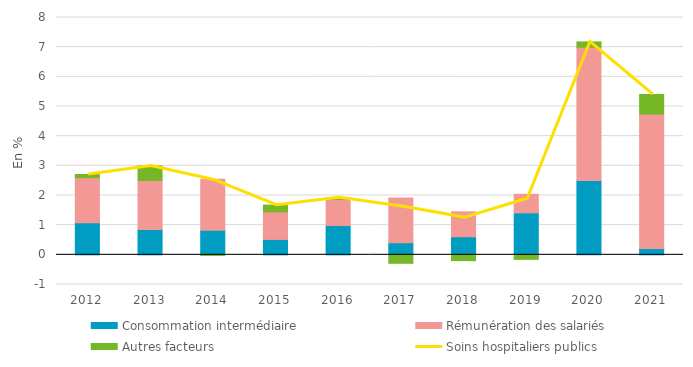
| Category | Consommation intermédiaire | Rémunération des salariés | Autres facteurs |
|---|---|---|---|
| 2012.0 | 1.085 | 1.518 | 0.105 |
| 2013.0 | 0.85 | 1.657 | 0.487 |
| 2014.0 | 0.829 | 1.715 | -0.02 |
| 2015.0 | 0.519 | 0.93 | 0.227 |
| 2016.0 | 0.987 | 0.88 | 0.053 |
| 2017.0 | 0.407 | 1.507 | -0.286 |
| 2018.0 | 0.609 | 0.841 | -0.195 |
| 2019.0 | 1.415 | 0.626 | -0.152 |
| 2020.0 | 2.502 | 4.496 | 0.179 |
| 2021.0 | 0.214 | 4.53 | 0.661 |